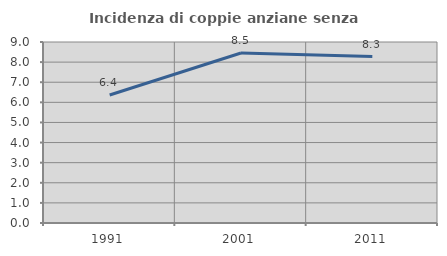
| Category | Incidenza di coppie anziane senza figli  |
|---|---|
| 1991.0 | 6.364 |
| 2001.0 | 8.451 |
| 2011.0 | 8.274 |